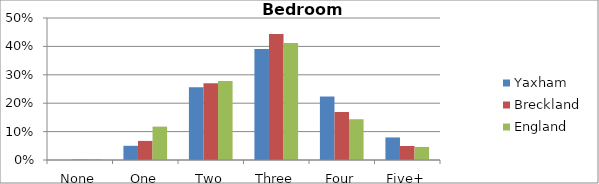
| Category | Yaxham | Breckland | England |
|---|---|---|---|
| None | 0 | 0.001 | 0.002 |
| One | 0.05 | 0.067 | 0.118 |
| Two | 0.256 | 0.27 | 0.279 |
| Three | 0.391 | 0.443 | 0.412 |
| Four | 0.224 | 0.169 | 0.144 |
| Five+ | 0.079 | 0.049 | 0.046 |